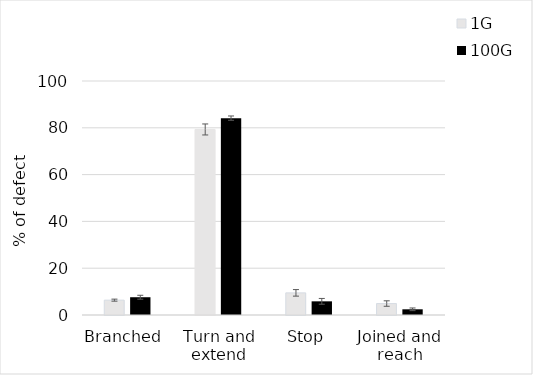
| Category | 1G | 100G |
|---|---|---|
| Branched  | 6.347 | 7.595 |
| Turn and extend | 79.291 | 84.132 |
| Stop | 9.461 | 5.839 |
| Joined and reach | 4.9 | 2.434 |